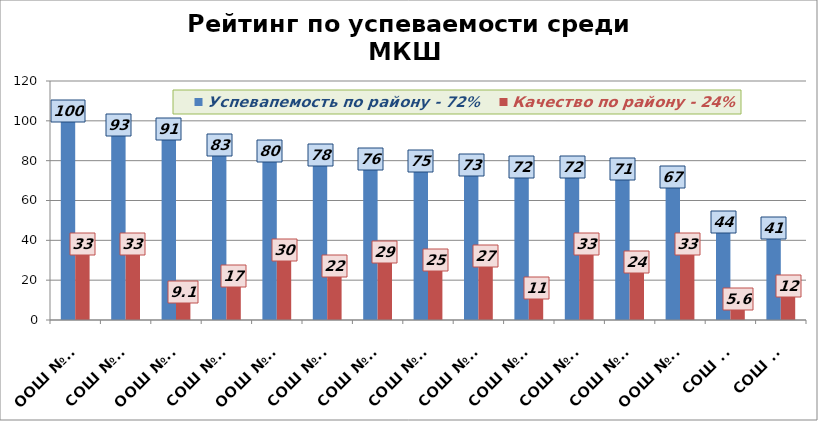
| Category | Успевапемость по району - 72% | Качество по району - 24% |
|---|---|---|
| ООШ №31 | 100 | 33 |
| СОШ №10 | 93 | 33 |
| ООШ №26 | 91 | 9.1 |
| СОШ №17 | 83 | 17 |
| ООШ №28 | 80 | 30 |
| СОШ №21 | 78 | 22 |
| СОШ №24 | 76 | 29 |
| СОШ №18 | 75 | 25 |
| СОШ №22 | 73 | 27 |
| СОШ №14 | 72 | 11 |
| СОШ №15 | 72 | 33 |
| СОШ №16 | 71 | 24 |
| ООШ №27 | 67 | 33 |
| СОШ №8 | 44 | 5.6 |
| СОШ №9 | 41 | 12 |